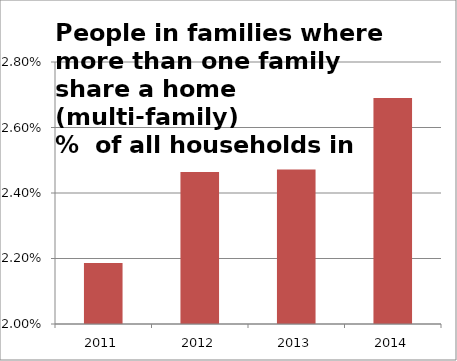
| Category | Series 1 |
|---|---|
| 2011.0 | 0.022 |
| 2012.0 | 0.025 |
| 2013.0 | 0.025 |
| 2014.0 | 0.027 |